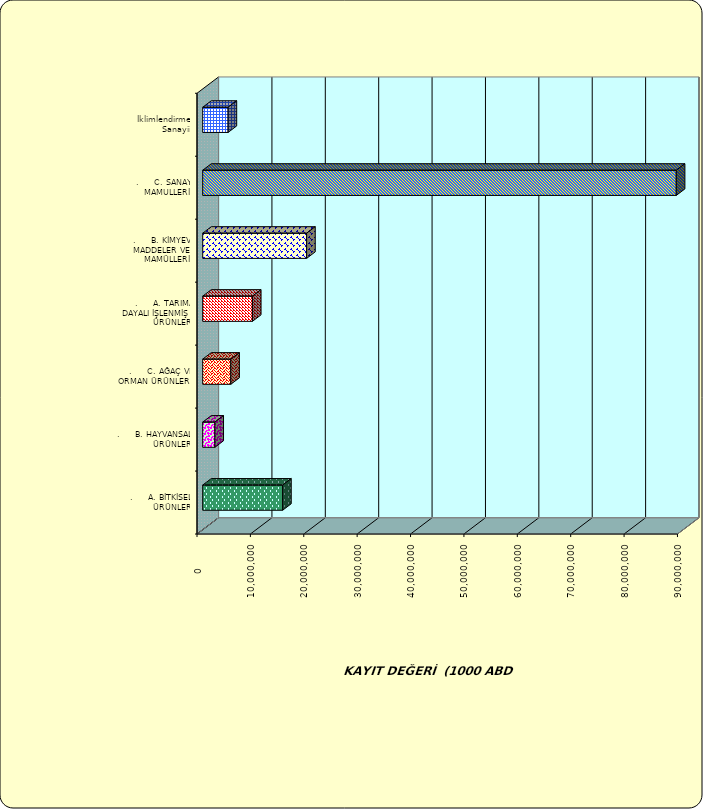
| Category | Series 0 |
|---|---|
| .     A. BİTKİSEL ÜRÜNLER | 14972670.804 |
| .     B. HAYVANSAL ÜRÜNLER | 2288646.387 |
| .     C. AĞAÇ VE ORMAN ÜRÜNLERİ | 5265502.496 |
| .     A. TARIMA DAYALI İŞLENMİŞ ÜRÜNLER | 9317592.914 |
| .     B. KİMYEVİ MADDELER VE MAMÜLLERİ | 19470715.003 |
| .     C. SANAYİ MAMULLERİ | 88711441.666 |
|  İklimlendirme Sanayii | 4755843.602 |